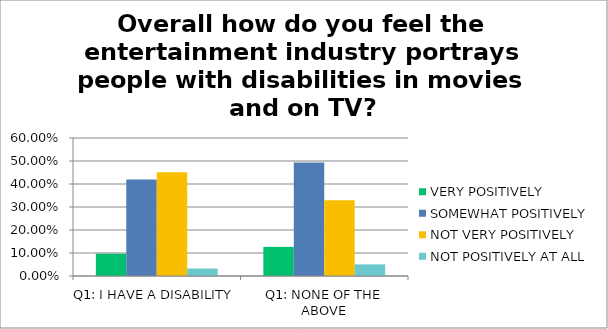
| Category | VERY POSITIVELY | SOMEWHAT POSITIVELY | NOT VERY POSITIVELY | NOT POSITIVELY AT ALL |
|---|---|---|---|---|
| Q1: I HAVE A DISABILITY | 0.097 | 0.419 | 0.452 | 0.032 |
| Q1: NONE OF THE ABOVE | 0.127 | 0.494 | 0.329 | 0.051 |